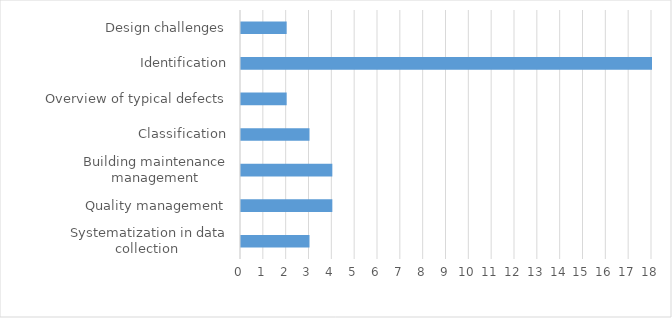
| Category | Number of articles per  |
|---|---|
| Design challenges | 2 |
| Identification | 18 |
| Overview of typical defects | 2 |
| Classification | 3 |
| Building maintenance management | 4 |
| Quality management | 4 |
| Systematization in data collection  | 3 |